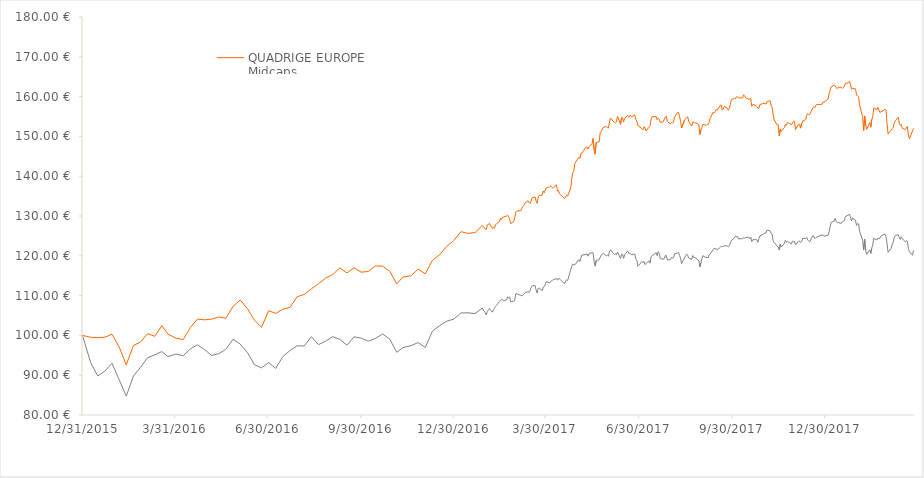
| Category |  QUADRIGE EUROPE
Midcaps    |  Stoxx Europe Ex UK Small Net Return  |
|---|---|---|
| 12/31/15 | 100 | 100 |
| 1/8/16 | 99.53 | 93.186 |
| 1/15/16 | 99.42 | 89.81 |
| 1/22/16 | 99.55 | 91.035 |
| 1/29/16 | 100.31 | 93.024 |
| 2/5/16 | 97.11 | 88.883 |
| 2/12/16 | 92.59 | 84.746 |
| 2/19/16 | 97.46 | 89.771 |
| 2/26/16 | 98.31 | 91.98 |
| 3/4/16 | 100.46 | 94.39 |
| 3/11/16 | 99.77 | 95.116 |
| 3/18/16 | 102.42 | 95.935 |
| 3/24/16 | 100.32 | 94.673 |
| 4/1/16 | 99.28 | 95.319 |
| 4/8/16 | 98.94 | 94.872 |
| 4/15/16 | 101.95 | 96.62 |
| 4/22/16 | 104.09 | 97.627 |
| 4/29/16 | 103.92 | 96.434 |
| 5/6/16 | 104.08 | 94.964 |
| 5/13/16 | 104.63 | 95.412 |
| 5/20/16 | 104.33 | 96.51 |
| 5/27/16 | 107.27 | 99.025 |
| 6/3/16 | 108.9 | 97.822 |
| 6/10/16 | 106.78 | 95.755 |
| 6/17/16 | 103.83 | 92.646 |
| 6/24/16 | 102.03 | 91.833 |
| 7/1/16 | 106.22 | 93.156 |
| 7/8/16 | 105.52 | 91.714 |
| 7/15/16 | 106.58 | 94.707 |
| 7/22/16 | 107.04 | 96.186 |
| 7/29/16 | 109.71 | 97.385 |
| 8/5/16 | 110.29 | 97.348 |
| 8/12/16 | 111.7 | 99.682 |
| 8/19/16 | 112.97 | 97.683 |
| 8/26/16 | 114.38 | 98.537 |
| 9/2/16 | 115.3 | 99.693 |
| 9/9/16 | 116.95 | 98.993 |
| 9/16/16 | 115.72 | 97.554 |
| 9/23/16 | 116.98 | 99.646 |
| 9/30/16 | 115.88 | 99.306 |
| 10/7/16 | 116.07 | 98.55 |
| 10/14/16 | 117.45 | 99.231 |
| 10/21/16 | 117.41 | 100.348 |
| 10/28/16 | 116.11 | 99.094 |
| 11/4/16 | 112.96 | 95.749 |
| 11/10/16 | 114.64 | 96.922 |
| 11/18/16 | 114.99 | 97.437 |
| 11/25/16 | 116.66 | 98.2 |
| 12/2/16 | 115.47 | 96.974 |
| 12/9/16 | 118.85 | 101.063 |
| 12/16/16 | 120.26 | 102.444 |
| 12/23/16 | 122.36 | 103.564 |
| 12/30/16 | 123.81 | 104.089 |
| 1/6/17 | 126.06 | 105.639 |
| 1/13/17 | 125.63 | 105.667 |
| 1/20/17 | 125.84 | 105.481 |
| 1/27/17 | 127.62 | 106.868 |
| 1/30/17 | 126.7 | 105.623 |
| 1/31/17 | 126.57 | 105.126 |
| 2/1/17 | 127.78 | 106.058 |
| 2/2/17 | 127.81 | 106.291 |
| 2/3/17 | 128.17 | 106.762 |
| 2/6/17 | 126.85 | 105.827 |
| 2/7/17 | 127.16 | 106.445 |
| 2/8/17 | 126.91 | 106.819 |
| 2/9/17 | 127.85 | 107.249 |
| 2/10/17 | 128 | 107.558 |
| 2/13/17 | 128.62 | 108.502 |
| 2/14/17 | 129.45 | 108.857 |
| 2/15/17 | 129.13 | 109.04 |
| 2/16/17 | 129.71 | 108.969 |
| 2/17/17 | 129.74 | 108.658 |
| 2/20/17 | 130 | 108.958 |
| 2/21/17 | 130.21 | 109.684 |
| 2/22/17 | 129.76 | 109.459 |
| 2/23/17 | 129.15 | 109.671 |
| 2/24/17 | 128.09 | 108.407 |
| 2/27/17 | 128.61 | 108.569 |
| 2/28/17 | 129.59 | 108.904 |
| 3/1/17 | 131.04 | 110.464 |
| 3/2/17 | 131.18 | 110.557 |
| 3/3/17 | 131.27 | 110.333 |
| 3/6/17 | 131.34 | 110.045 |
| 3/7/17 | 131.94 | 109.952 |
| 3/8/17 | 132.4 | 110.101 |
| 3/9/17 | 132.69 | 110.4 |
| 3/10/17 | 133.23 | 110.706 |
| 3/13/17 | 133.82 | 111.003 |
| 3/14/17 | 133.45 | 110.797 |
| 3/15/17 | 133.14 | 111.165 |
| 3/16/17 | 133.75 | 112.042 |
| 3/17/17 | 134.56 | 112.451 |
| 3/20/17 | 134.8 | 112.515 |
| 3/21/17 | 133.73 | 111.357 |
| 3/22/17 | 133.17 | 110.661 |
| 3/23/17 | 134.76 | 111.783 |
| 3/24/17 | 135.17 | 111.886 |
| 3/27/17 | 135.25 | 111.242 |
| 3/28/17 | 136.3 | 112.139 |
| 3/29/17 | 135.83 | 112.252 |
| 3/30/17 | 136.54 | 112.837 |
| 3/31/17 | 137.07 | 113.527 |
| 4/3/17 | 137.28 | 113.211 |
| 4/4/17 | 137.52 | 113.486 |
| 4/5/17 | 137.4 | 113.747 |
| 4/6/17 | 137.08 | 113.853 |
| 4/7/17 | 137.12 | 113.998 |
| 4/10/17 | 137.84 | 114.288 |
| 4/11/17 | 136.25 | 113.873 |
| 4/12/17 | 136.38 | 114.402 |
| 4/13/17 | 135.57 | 114.171 |
| 4/18/17 | 134.36 | 113.01 |
| 4/19/17 | 134.8 | 113.641 |
| 4/20/17 | 135.23 | 113.987 |
| 4/21/17 | 135 | 113.812 |
| 4/24/17 | 137.05 | 116.485 |
| 4/25/17 | 139.34 | 117.333 |
| 4/26/17 | 140.88 | 117.908 |
| 4/27/17 | 141.24 | 117.778 |
| 4/28/17 | 143.14 | 117.724 |
| 5/2/17 | 144.79 | 119.025 |
| 5/3/17 | 144.45 | 118.56 |
| 5/4/17 | 145.74 | 119.444 |
| 5/5/17 | 145.8 | 120.188 |
| 5/9/17 | 147.32 | 120.313 |
| 5/10/17 | 147.28 | 120.494 |
| 5/11/17 | 146.85 | 119.9 |
| 5/12/17 | 147.39 | 120.471 |
| 5/15/17 | 148.21 | 120.829 |
| 5/16/17 | 149.47 | 120.713 |
| 5/17/17 | 146.55 | 118.517 |
| 5/18/17 | 145.54 | 117.408 |
| 5/19/17 | 148.45 | 118.82 |
| 5/22/17 | 148.65 | 119.04 |
| 5/23/17 | 151 | 119.652 |
| 5/24/17 | 151.19 | 120.17 |
| 5/26/17 | 152.33 | 120.633 |
| 5/29/17 | 152.45 | 120.006 |
| 5/30/17 | 152.26 | 120.151 |
| 5/31/17 | 152.08 | 119.902 |
| 6/1/17 | 153.35 | 120.892 |
| 6/2/17 | 154.62 | 121.528 |
| 6/6/17 | 153.5 | 120.345 |
| 6/7/17 | 153.38 | 120.462 |
| 6/8/17 | 153.63 | 120.248 |
| 6/9/17 | 155.05 | 120.94 |
| 6/12/17 | 153.04 | 119.345 |
| 6/13/17 | 154.75 | 120.404 |
| 6/14/17 | 154.63 | 120.386 |
| 6/15/17 | 153.7 | 119.371 |
| 6/16/17 | 154.51 | 120.246 |
| 6/19/17 | 155.31 | 121.26 |
| 6/20/17 | 154.8 | 120.607 |
| 6/21/17 | 155.22 | 120.583 |
| 6/22/17 | 155.25 | 120.531 |
| 6/23/17 | 154.92 | 120.222 |
| 6/26/17 | 155.41 | 120.488 |
| 6/27/17 | 154.18 | 119.165 |
| 6/28/17 | 153.86 | 118.951 |
| 6/29/17 | 152.71 | 117.376 |
| 6/30/17 | 152.57 | 117.644 |
| 7/3/17 | 151.97 | 118.586 |
| 7/4/17 | 151.69 | 118.288 |
| 7/5/17 | 152.45 | 118.636 |
| 7/6/17 | 152.12 | 117.815 |
| 7/7/17 | 151.35 | 117.996 |
| 7/10/17 | 152.31 | 118.783 |
| 7/11/17 | 152.59 | 118.156 |
| 7/12/17 | 154.25 | 119.745 |
| 7/13/17 | 154.95 | 120.023 |
| 7/17/17 | 154.99 | 120.773 |
| 7/18/17 | 154.21 | 120.026 |
| 7/19/17 | 154.6 | 121.033 |
| 7/20/17 | 154.36 | 120.583 |
| 7/21/17 | 153.55 | 119.325 |
| 7/24/17 | 153.66 | 119.133 |
| 7/25/17 | 154.34 | 119.282 |
| 7/26/17 | 154.85 | 120.062 |
| 7/27/17 | 155.06 | 120.045 |
| 7/28/17 | 153.71 | 118.969 |
| 7/31/17 | 153.13 | 119.046 |
| 8/1/17 | 153.55 | 119.593 |
| 8/2/17 | 153.32 | 119.433 |
| 8/3/17 | 153.6 | 119.487 |
| 8/4/17 | 154.83 | 120.486 |
| 8/7/17 | 156.02 | 120.704 |
| 8/8/17 | 156.01 | 120.875 |
| 8/9/17 | 154.97 | 120.067 |
| 8/10/17 | 153.8 | 119.381 |
| 8/11/17 | 152.12 | 118.024 |
| 8/14/17 | 154.15 | 119.567 |
| 8/16/17 | 154.77 | 120.419 |
| 8/17/17 | 154.91 | 120.071 |
| 8/18/17 | 153.71 | 119.433 |
| 8/21/17 | 152.61 | 119.118 |
| 8/22/17 | 153.66 | 120.064 |
| 8/23/17 | 153.58 | 119.563 |
| 8/24/17 | 153.3 | 119.541 |
| 8/25/17 | 153.43 | 119.487 |
| 8/28/17 | 152.95 | 118.683 |
| 8/29/17 | 150.48 | 117.181 |
| 8/30/17 | 151.64 | 118.236 |
| 8/31/17 | 152.3 | 119.343 |
| 9/1/17 | 153.1 | 120.032 |
| 9/4/17 | 152.74 | 119.541 |
| 9/5/17 | 153.04 | 119.626 |
| 9/6/17 | 152.97 | 119.444 |
| 9/7/17 | 153.51 | 120.194 |
| 9/8/17 | 154.45 | 120.438 |
| 9/11/17 | 156.07 | 121.506 |
| 9/12/17 | 155.96 | 121.893 |
| 9/13/17 | 156.21 | 121.711 |
| 9/14/17 | 156.81 | 121.845 |
| 9/15/17 | 156.56 | 121.476 |
| 9/18/17 | 157.79 | 122.113 |
| 9/19/17 | 157.9 | 122.394 |
| 9/20/17 | 156.63 | 122.325 |
| 9/21/17 | 156.84 | 122.34 |
| 9/22/17 | 157.57 | 122.55 |
| 9/25/17 | 157.1 | 122.47 |
| 9/26/17 | 156.55 | 122.262 |
| 9/27/17 | 157.08 | 122.604 |
| 9/28/17 | 158.11 | 123.246 |
| 9/29/17 | 159.27 | 123.849 |
| 10/2/17 | 159.55 | 124.532 |
| 10/3/17 | 159.42 | 125.018 |
| 10/4/17 | 159.95 | 124.704 |
| 10/5/17 | 160.04 | 124.813 |
| 10/6/17 | 159.66 | 124.24 |
| 10/9/17 | 159.67 | 124.326 |
| 10/10/17 | 159.65 | 124.406 |
| 10/11/17 | 160.44 | 124.497 |
| 10/12/17 | 160.2 | 124.471 |
| 10/13/17 | 159.67 | 124.599 |
| 10/16/17 | 159.38 | 124.64 |
| 10/17/17 | 159.36 | 124.238 |
| 10/18/17 | 159.6 | 124.668 |
| 10/19/17 | 157.56 | 123.581 |
| 10/20/17 | 158.03 | 124.026 |
| 10/23/17 | 157.71 | 124.099 |
| 10/24/17 | 157.53 | 123.978 |
| 10/25/17 | 157.06 | 123.373 |
| 10/26/17 | 157.04 | 124.326 |
| 10/27/17 | 158 | 124.996 |
| 10/30/17 | 158.25 | 125.361 |
| 10/31/17 | 158.34 | 125.623 |
| 11/2/17 | 158.1 | 125.744 |
| 11/3/17 | 158.69 | 126.41 |
| 11/6/17 | 159 | 126.289 |
| 11/7/17 | 157.89 | 125.668 |
| 11/8/17 | 157.18 | 125.47 |
| 11/9/17 | 155.44 | 123.788 |
| 11/10/17 | 154.12 | 123.323 |
| 11/13/17 | 152.87 | 122.42 |
| 11/14/17 | 152.96 | 122.254 |
| 11/15/17 | 150.11 | 121.469 |
| 11/16/17 | 151.8 | 122.939 |
| 11/17/17 | 151.28 | 122.21 |
| 11/20/17 | 152.2 | 123.053 |
| 11/21/17 | 152.96 | 123.888 |
| 11/22/17 | 152.78 | 123.408 |
| 11/23/17 | 153.46 | 123.637 |
| 11/24/17 | 153.45 | 123.47 |
| 11/27/17 | 152.92 | 123.012 |
| 11/28/17 | 153.34 | 123.712 |
| 11/29/17 | 153.77 | 123.492 |
| 11/30/17 | 153.83 | 123.604 |
| 12/1/17 | 151.74 | 122.744 |
| 12/4/17 | 153.07 | 123.68 |
| 12/5/17 | 153.06 | 123.704 |
| 12/6/17 | 152.07 | 123.341 |
| 12/7/17 | 153.22 | 123.553 |
| 12/8/17 | 153.87 | 124.439 |
| 12/11/17 | 154.18 | 124.305 |
| 12/12/17 | 155.28 | 124.603 |
| 12/13/17 | 155.73 | 123.97 |
| 12/14/17 | 155.46 | 123.708 |
| 12/15/17 | 155.52 | 123.507 |
| 12/18/17 | 157.15 | 125.085 |
| 12/19/17 | 157.42 | 124.886 |
| 12/20/17 | 157.24 | 124.326 |
| 12/21/17 | 157.82 | 124.588 |
| 12/22/17 | 158.01 | 124.7 |
| 12/27/17 | 158.05 | 125.234 |
| 12/28/17 | 158.56 | 125.169 |
| 12/29/17 | 158.6 | 124.923 |
| 1/2/18 | 159.35 | 125.141 |
| 1/3/18 | 160.75 | 126.057 |
| 1/4/18 | 161.48 | 127.248 |
| 1/5/18 | 162.45 | 128.387 |
| 1/8/18 | 162.89 | 128.755 |
| 1/9/18 | 162.74 | 129.375 |
| 1/10/18 | 162.23 | 128.638 |
| 1/11/18 | 161.99 | 128.318 |
| 1/12/18 | 162.36 | 128.333 |
| 1/15/18 | 162.33 | 128.154 |
| 1/16/18 | 162.08 | 128.536 |
| 1/17/18 | 162.2 | 128.642 |
| 1/18/18 | 162.6 | 128.787 |
| 1/19/18 | 163.33 | 129.88 |
| 1/22/18 | 163.47 | 130.192 |
| 1/23/18 | 163.83 | 130.509 |
| 1/24/18 | 163.19 | 129.82 |
| 1/25/18 | 161.82 | 128.757 |
| 1/26/18 | 162.11 | 129.489 |
| 1/29/18 | 161.93 | 128.91 |
| 1/30/18 | 160.41 | 127.654 |
| 1/31/18 | 160.13 | 128.059 |
| 2/1/18 | 159.95 | 128.052 |
| 2/2/18 | 157.92 | 126.131 |
| 2/5/18 | 154.94 | 123.918 |
| 2/6/18 | 151.47 | 121.467 |
| 2/7/18 | 155.13 | 124.168 |
| 2/8/18 | 152.87 | 121.383 |
| 2/9/18 | 151.77 | 120.348 |
| 2/12/18 | 153.49 | 121.493 |
| 2/13/18 | 152.32 | 120.603 |
| 2/14/18 | 154.25 | 121.988 |
| 2/15/18 | 154.98 | 122.762 |
| 2/16/18 | 157.16 | 124.376 |
| 2/19/18 | 156.69 | 123.98 |
| 2/20/18 | 157.3 | 124.439 |
| 2/21/18 | 156.58 | 124.369 |
| 2/22/18 | 156.01 | 124.395 |
| 2/23/18 | 156.2 | 124.942 |
| 2/26/18 | 156.54 | 125.454 |
| 2/27/18 | 156.85 | 125.413 |
| 2/28/18 | 156.59 | 124.8 |
| 3/1/18 | 153.18 | 123.084 |
| 3/2/18 | 150.61 | 120.886 |
| 3/5/18 | 151.59 | 121.856 |
| 3/6/18 | 151.94 | 122.775 |
| 3/7/18 | 152.18 | 123.371 |
| 3/8/18 | 153.31 | 124.601 |
| 3/9/18 | 153.89 | 125.061 |
| 3/12/18 | 154.81 | 125.31 |
| 3/13/18 | 153.34 | 124.557 |
| 3/14/18 | 152.8 | 124.121 |
| 3/15/18 | 152.98 | 124.776 |
| 3/16/18 | 152.04 | 124.326 |
| 3/19/18 | 151.71 | 123.518 |
| 3/20/18 | 152.11 | 123.803 |
| 3/21/18 | 152.47 | 123.665 |
| 3/22/18 | 150.36 | 121.811 |
| 3/23/18 | 149.39 | 121.041 |
| 3/26/18 | 151.33 | 120.127 |
| 3/27/18 | 152 | 121.361 |